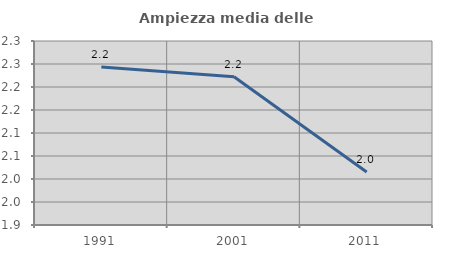
| Category | Ampiezza media delle famiglie |
|---|---|
| 1991.0 | 2.243 |
| 2001.0 | 2.222 |
| 2011.0 | 2.015 |